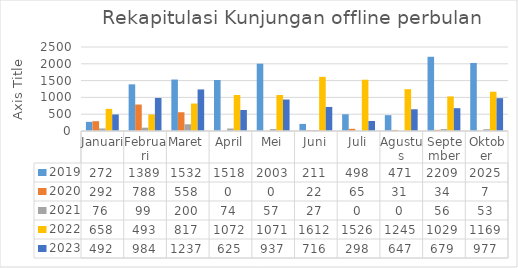
| Category | 2019 | 2020 | 2021 | 2022 | 2023 |
|---|---|---|---|---|---|
| Januari | 272 | 292 | 76 | 658 | 492 |
| Februari | 1389 | 788 | 99 | 493 | 984 |
| Maret | 1532 | 558 | 200 | 817 | 1237 |
| April | 1518 | 0 | 74 | 1072 | 625 |
| Mei | 2003 | 0 | 57 | 1071 | 937 |
| Juni | 211 | 22 | 27 | 1612 | 716 |
| Juli | 498 | 65 | 0 | 1526 | 298 |
| Agustus | 471 | 31 | 0 | 1245 | 647 |
| September | 2209 | 34 | 56 | 1029 | 679 |
| Oktober | 2025 | 7 | 53 | 1169 | 977 |